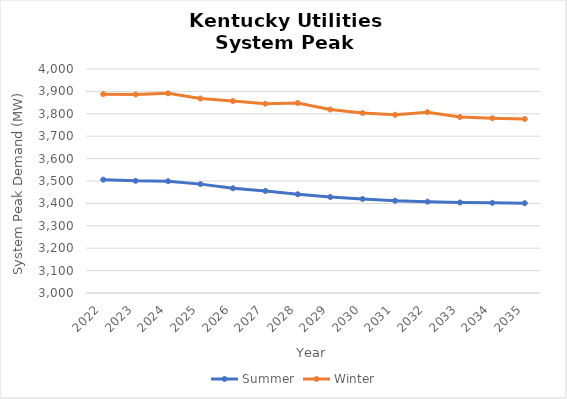
| Category | Summer | Winter |
|---|---|---|
| 2022.0 | 3506.04 | 3887.79 |
| 2023.0 | 3500.808 | 3886.305 |
| 2024.0 | 3499.125 | 3891.277 |
| 2025.0 | 3486.071 | 3867.929 |
| 2026.0 | 3467.552 | 3856.935 |
| 2027.0 | 3455.663 | 3845.185 |
| 2028.0 | 3440.735 | 3848.29 |
| 2029.0 | 3428.581 | 3819.069 |
| 2030.0 | 3419.852 | 3803.525 |
| 2031.0 | 3411.712 | 3795.534 |
| 2032.0 | 3407.785 | 3807.125 |
| 2033.0 | 3403.975 | 3785.555 |
| 2034.0 | 3402.438 | 3780.182 |
| 2035.0 | 3400.955 | 3777.027 |